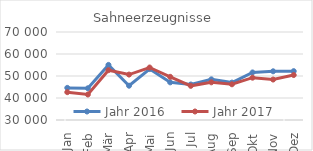
| Category | Jahr 2016 | Jahr 2017 |
|---|---|---|
| Jan | 44600.496 | 42651.859 |
| Feb | 44414.543 | 41588.066 |
| Mär | 55049.127 | 52647.07 |
| Apr | 45589.812 | 50650.028 |
| Mai | 53152.596 | 53860.066 |
| Jun | 47113.601 | 49617.954 |
| Jul | 46130.329 | 45532.578 |
| Aug | 48483.58 | 47128.442 |
| Sep | 47002.925 | 46234.765 |
| Okt | 51612.72 | 49236.374 |
| Nov | 52135.591 | 48391.142 |
| Dez | 52201.767 | 50439.353 |